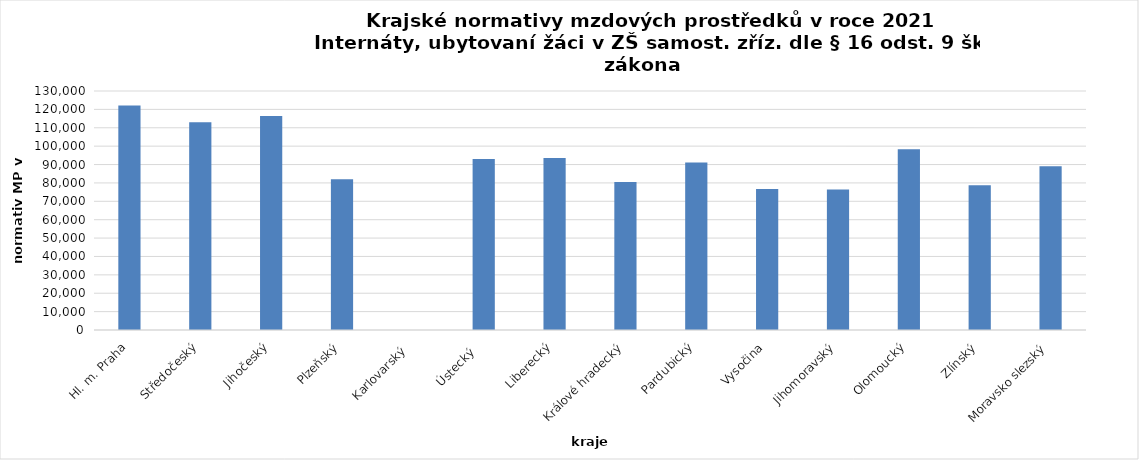
| Category | Series 0 |
|---|---|
| Hl. m. Praha | 122069.289 |
| Středočeský | 113028.791 |
| Jihočeský | 116424.861 |
| Plzeňský | 81988.502 |
| Karlovarský  | 0 |
| Ústecký   | 93049.289 |
| Liberecký | 93514.355 |
| Králové hradecký | 80562.623 |
| Pardubický | 91158.441 |
| Vysočina | 76690.16 |
| Jihomoravský | 76411.588 |
| Olomoucký | 98292.102 |
| Zlínský | 78777.955 |
| Moravsko slezský | 89067.542 |